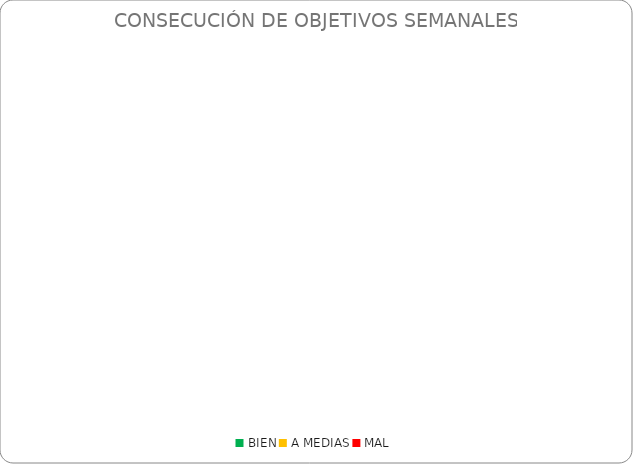
| Category | Series 0 |
|---|---|
| BIEN | 0 |
| A MEDIAS | 0 |
| MAL | 0 |